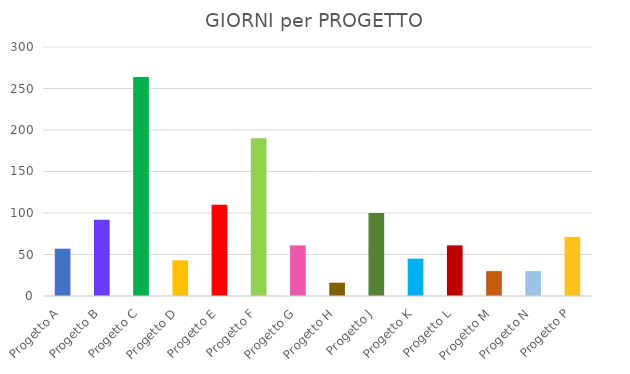
| Category | N. di GIORNI |
|---|---|
| Progetto A | 57 |
| Progetto B | 92 |
| Progetto C | 264 |
| Progetto D | 43 |
| Progetto E | 110 |
| Progetto F | 190 |
| Progetto G | 61 |
| Progetto H | 16 |
| Progetto J | 100 |
| Progetto K | 45 |
| Progetto L | 61 |
| Progetto M | 30 |
| Progetto N | 30 |
| Progetto P | 71 |